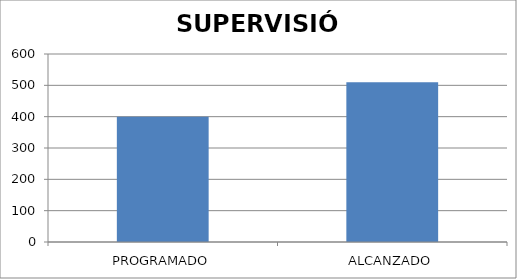
| Category | SUPERVISIÓN |
|---|---|
| PROGRAMADO | 400 |
| ALCANZADO | 510 |